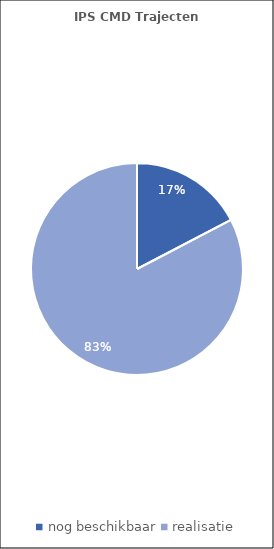
| Category | Series 0 |
|---|---|
| nog beschikbaar | 13 |
| realisatie | 62 |